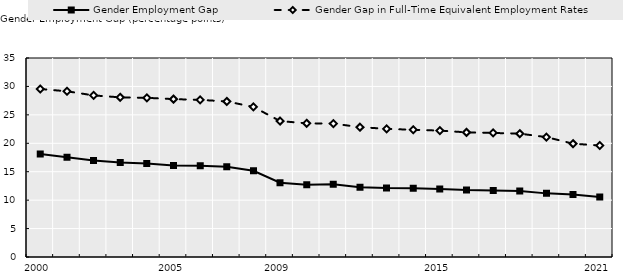
| Category | Gender Employment Gap | Gender Gap in Full-Time Equivalent Employment Rates |
|---|---|---|
| 2000.0 | 18.108 | 29.548 |
| nan | 17.547 | 29.146 |
| nan | 16.978 | 28.421 |
| nan | 16.636 | 28.08 |
| nan | 16.442 | 27.996 |
| 2005.0 | 16.088 | 27.769 |
| nan | 16.038 | 27.632 |
| nan | 15.886 | 27.365 |
| nan | 15.159 | 26.396 |
| 2009.0 | 13.06 | 23.906 |
| nan | 12.72 | 23.511 |
| nan | 12.812 | 23.461 |
| nan | 12.282 | 22.837 |
| nan | 12.116 | 22.542 |
| nan | 12.085 | 22.37 |
| 2015.0 | 11.965 | 22.233 |
| nan | 11.77 | 21.922 |
| nan | 11.698 | 21.819 |
| nan | 11.607 | 21.695 |
| nan | 11.191 | 21.085 |
| nan | 10.977 | 19.929 |
| 2021.0 | 10.544 | 19.61 |